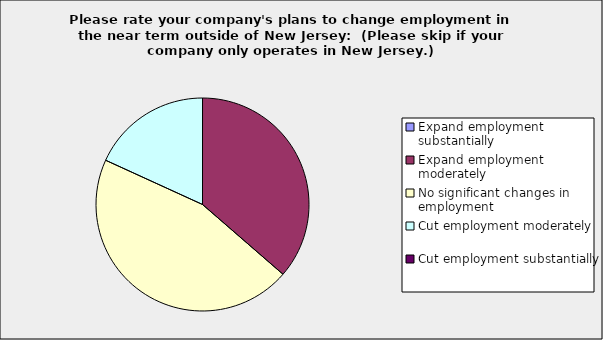
| Category | Series 0 |
|---|---|
| Expand employment substantially | 0 |
| Expand employment moderately | 0.364 |
| No significant changes in employment | 0.455 |
| Cut employment moderately | 0.182 |
| Cut employment substantially | 0 |